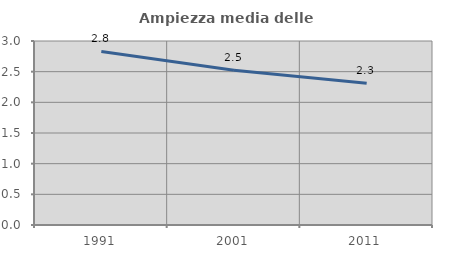
| Category | Ampiezza media delle famiglie |
|---|---|
| 1991.0 | 2.831 |
| 2001.0 | 2.524 |
| 2011.0 | 2.31 |